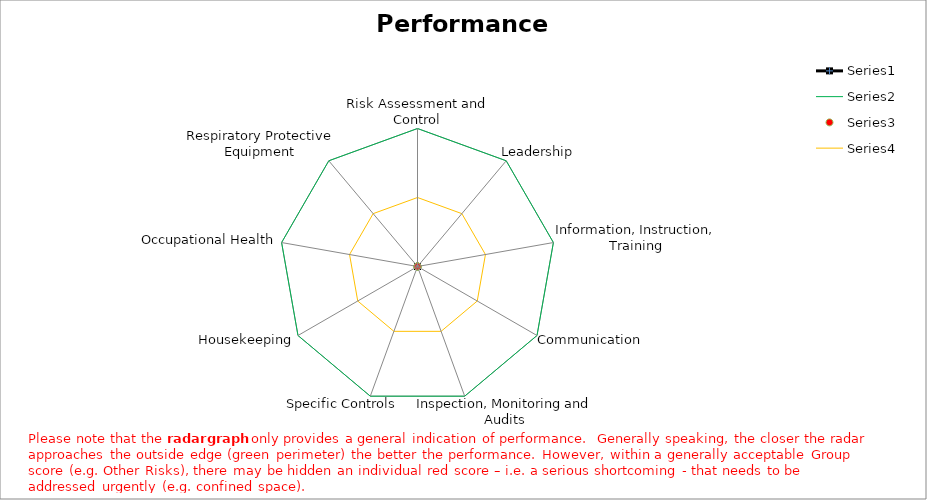
| Category | Series 0 | Series 1 | Series 2 | Series 3 |
|---|---|---|---|---|
| Risk Assessment and Control | 0 | 100 | 0 | 50 |
| Leadership | 0 | 100 | 0 | 50 |
| Information, Instruction, Training | 0 | 100 | 0 | 50 |
| Communication | 0 | 100 | 0 | 50 |
| Inspection, Monitoring and Audits | 0 | 100 | 0 | 50 |
| Specific Controls | 0 | 100 | 0 | 50 |
| Housekeeping | 0 | 100 | 0 | 50 |
| Occupational Health | 0 | 100 | 0 | 50 |
| Respiratory Protective Equipment | 0 | 100 | 0 | 50 |